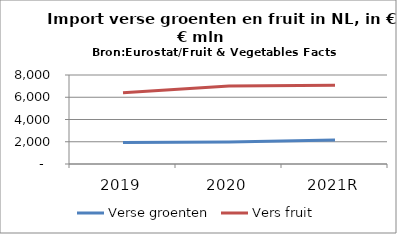
| Category | Verse groenten | Vers fruit |
|---|---|---|
| 2019 | 1936 | 6399 |
| 2020 | 1986 | 7008 |
| 2021R | 2158 | 7074 |